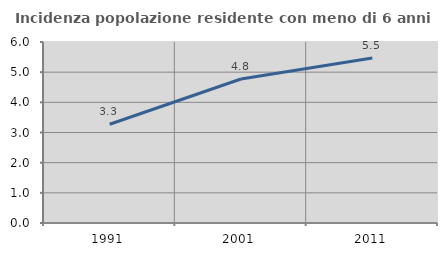
| Category | Incidenza popolazione residente con meno di 6 anni |
|---|---|
| 1991.0 | 3.273 |
| 2001.0 | 4.773 |
| 2011.0 | 5.473 |